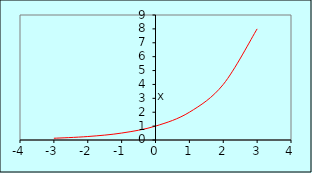
| Category | Series 0 |
|---|---|
| -3.0 | 0.125 |
| -2.0 | 0.25 |
| -1.0 | 0.5 |
| 0.0 | 1 |
| 1.0 | 2 |
| 2.0 | 4 |
| 3.0 | 8 |